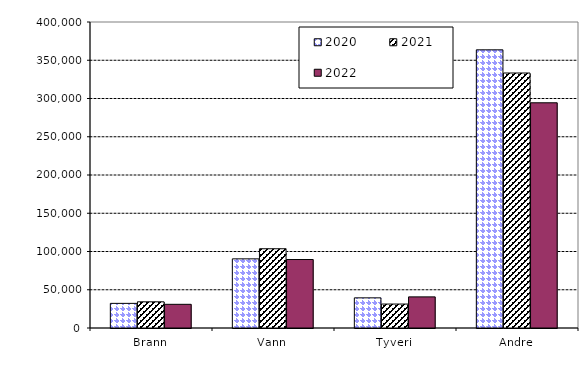
| Category | 2020 | 2021 | 2022 |
|---|---|---|---|
| Brann | 32197.085 | 34228.25 | 30958.735 |
| Vann | 90395.745 | 103582.855 | 89507.29 |
| Tyveri | 39406.155 | 31303.148 | 40682.805 |
| Andre | 363630.106 | 333320.571 | 294391.065 |